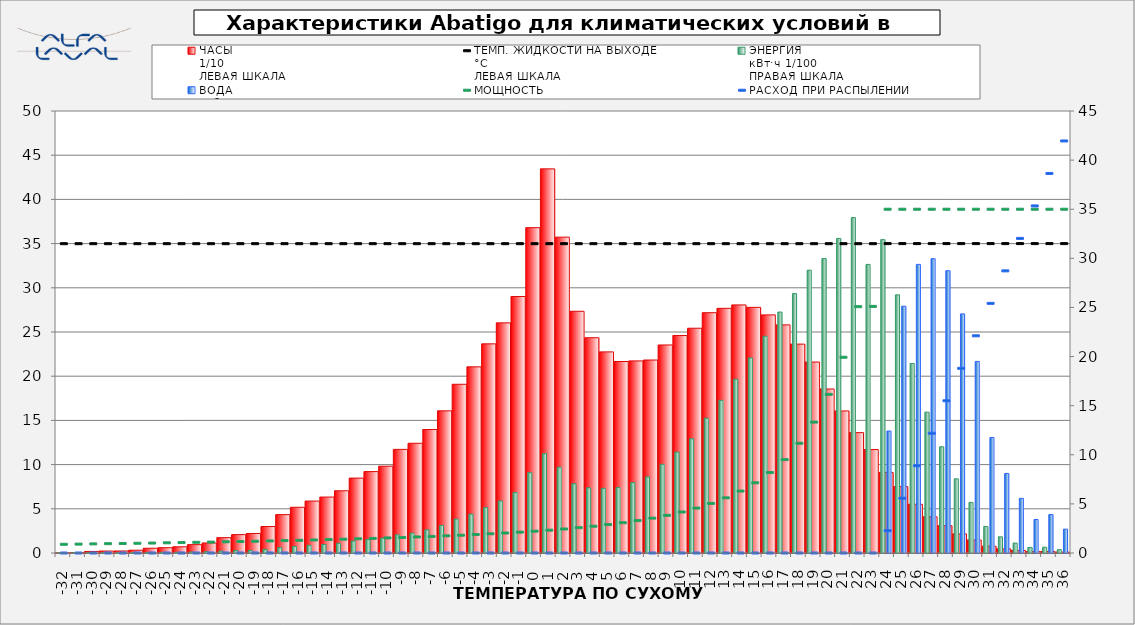
| Category | ЧАСЫ
1/10
ЛЕВАЯ ШКАЛА |
|---|---|
| -32.0 | 0.008 |
| -31.0 | 0.036 |
| -30.0 | 0.178 |
| -29.0 | 0.222 |
| -28.0 | 0.227 |
| -27.0 | 0.316 |
| -26.0 | 0.539 |
| -25.0 | 0.6 |
| -24.0 | 0.703 |
| -23.0 | 0.944 |
| -22.0 | 1.136 |
| -21.0 | 1.734 |
| -20.0 | 2.08 |
| -19.0 | 2.209 |
| -18.0 | 2.995 |
| -17.0 | 4.343 |
| -16.0 | 5.173 |
| -15.0 | 5.876 |
| -14.0 | 6.329 |
| -13.0 | 7.038 |
| -12.0 | 8.472 |
| -11.0 | 9.208 |
| -10.0 | 9.819 |
| -9.0 | 11.721 |
| -8.0 | 12.413 |
| -7.0 | 13.971 |
| -6.0 | 16.082 |
| -5.0 | 19.086 |
| -4.0 | 21.058 |
| -3.0 | 23.659 |
| -2.0 | 26.032 |
| -1.0 | 29.013 |
| 0.0 | 36.803 |
| 1.0 | 43.453 |
| 2.0 | 35.73 |
| 3.0 | 27.343 |
| 4.0 | 24.35 |
| 5.0 | 22.751 |
| 6.0 | 21.662 |
| 7.0 | 21.731 |
| 8.0 | 21.83 |
| 9.0 | 23.532 |
| 10.0 | 24.6 |
| 11.0 | 25.428 |
| 12.0 | 27.183 |
| 13.0 | 27.679 |
| 14.0 | 28.063 |
| 15.0 | 27.788 |
| 16.0 | 26.937 |
| 17.0 | 25.805 |
| 18.0 | 23.632 |
| 19.0 | 21.601 |
| 20.0 | 18.556 |
| 21.0 | 16.071 |
| 22.0 | 13.617 |
| 23.0 | 11.702 |
| 24.0 | 9.115 |
| 25.0 | 7.509 |
| 26.0 | 5.513 |
| 27.0 | 4.097 |
| 28.0 | 3.091 |
| 29.0 | 2.158 |
| 30.0 | 1.47 |
| 31.0 | 0.771 |
| 32.0 | 0.47 |
| 33.0 | 0.289 |
| 34.0 | 0.161 |
| 35.0 | 0.169 |
| 36.0 | 0.096 |